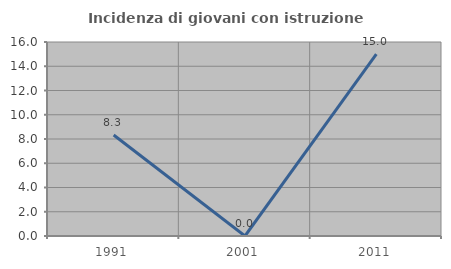
| Category | Incidenza di giovani con istruzione universitaria |
|---|---|
| 1991.0 | 8.333 |
| 2001.0 | 0 |
| 2011.0 | 15 |